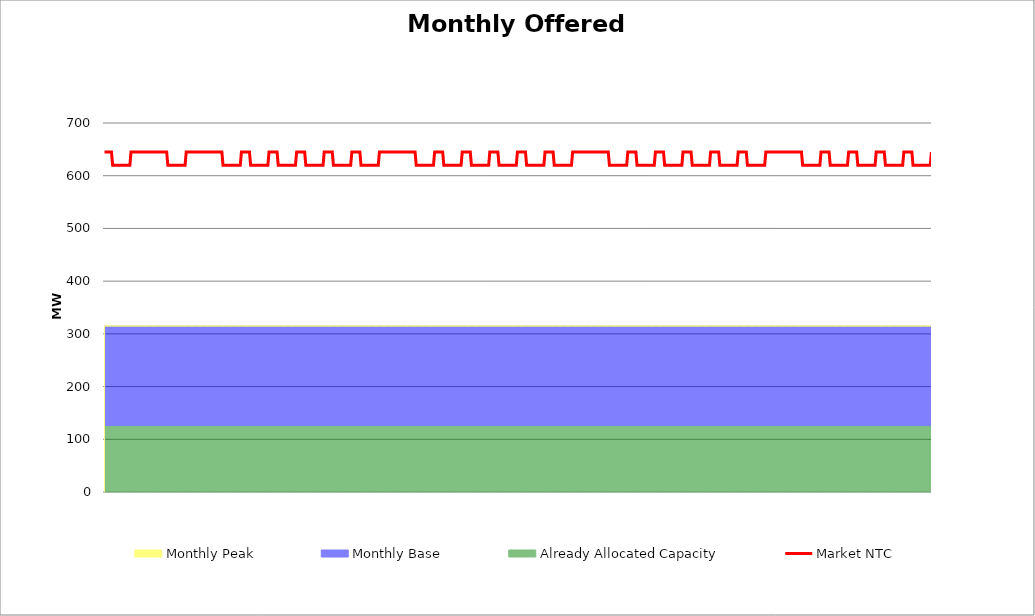
| Category | Market NTC |
|---|---|
| 0 | 645 |
| 1 | 645 |
| 2 | 645 |
| 3 | 645 |
| 4 | 645 |
| 5 | 645 |
| 6 | 645 |
| 7 | 620 |
| 8 | 620 |
| 9 | 620 |
| 10 | 620 |
| 11 | 620 |
| 12 | 620 |
| 13 | 620 |
| 14 | 620 |
| 15 | 620 |
| 16 | 620 |
| 17 | 620 |
| 18 | 620 |
| 19 | 620 |
| 20 | 620 |
| 21 | 620 |
| 22 | 620 |
| 23 | 645 |
| 24 | 645 |
| 25 | 645 |
| 26 | 645 |
| 27 | 645 |
| 28 | 645 |
| 29 | 645 |
| 30 | 645 |
| 31 | 645 |
| 32 | 645 |
| 33 | 645 |
| 34 | 645 |
| 35 | 645 |
| 36 | 645 |
| 37 | 645 |
| 38 | 645 |
| 39 | 645 |
| 40 | 645 |
| 41 | 645 |
| 42 | 645 |
| 43 | 645 |
| 44 | 645 |
| 45 | 645 |
| 46 | 645 |
| 47 | 645 |
| 48 | 645 |
| 49 | 645 |
| 50 | 645 |
| 51 | 645 |
| 52 | 645 |
| 53 | 645 |
| 54 | 645 |
| 55 | 620 |
| 56 | 620 |
| 57 | 620 |
| 58 | 620 |
| 59 | 620 |
| 60 | 620 |
| 61 | 620 |
| 62 | 620 |
| 63 | 620 |
| 64 | 620 |
| 65 | 620 |
| 66 | 620 |
| 67 | 620 |
| 68 | 620 |
| 69 | 620 |
| 70 | 620 |
| 71 | 645 |
| 72 | 645 |
| 73 | 645 |
| 74 | 645 |
| 75 | 645 |
| 76 | 645 |
| 77 | 645 |
| 78 | 645 |
| 79 | 645 |
| 80 | 645 |
| 81 | 645 |
| 82 | 645 |
| 83 | 645 |
| 84 | 645 |
| 85 | 645 |
| 86 | 645 |
| 87 | 645 |
| 88 | 645 |
| 89 | 645 |
| 90 | 645 |
| 91 | 645 |
| 92 | 645 |
| 93 | 645 |
| 94 | 645 |
| 95 | 645 |
| 96 | 645 |
| 97 | 645 |
| 98 | 645 |
| 99 | 645 |
| 100 | 645 |
| 101 | 645 |
| 102 | 645 |
| 103 | 620 |
| 104 | 620 |
| 105 | 620 |
| 106 | 620 |
| 107 | 620 |
| 108 | 620 |
| 109 | 620 |
| 110 | 620 |
| 111 | 620 |
| 112 | 620 |
| 113 | 620 |
| 114 | 620 |
| 115 | 620 |
| 116 | 620 |
| 117 | 620 |
| 118 | 620 |
| 119 | 645 |
| 120 | 645 |
| 121 | 645 |
| 122 | 645 |
| 123 | 645 |
| 124 | 645 |
| 125 | 645 |
| 126 | 645 |
| 127 | 620 |
| 128 | 620 |
| 129 | 620 |
| 130 | 620 |
| 131 | 620 |
| 132 | 620 |
| 133 | 620 |
| 134 | 620 |
| 135 | 620 |
| 136 | 620 |
| 137 | 620 |
| 138 | 620 |
| 139 | 620 |
| 140 | 620 |
| 141 | 620 |
| 142 | 620 |
| 143 | 645 |
| 144 | 645 |
| 145 | 645 |
| 146 | 645 |
| 147 | 645 |
| 148 | 645 |
| 149 | 645 |
| 150 | 645 |
| 151 | 620 |
| 152 | 620 |
| 153 | 620 |
| 154 | 620 |
| 155 | 620 |
| 156 | 620 |
| 157 | 620 |
| 158 | 620 |
| 159 | 620 |
| 160 | 620 |
| 161 | 620 |
| 162 | 620 |
| 163 | 620 |
| 164 | 620 |
| 165 | 620 |
| 166 | 620 |
| 167 | 645 |
| 168 | 645 |
| 169 | 645 |
| 170 | 645 |
| 171 | 645 |
| 172 | 645 |
| 173 | 645 |
| 174 | 645 |
| 175 | 620 |
| 176 | 620 |
| 177 | 620 |
| 178 | 620 |
| 179 | 620 |
| 180 | 620 |
| 181 | 620 |
| 182 | 620 |
| 183 | 620 |
| 184 | 620 |
| 185 | 620 |
| 186 | 620 |
| 187 | 620 |
| 188 | 620 |
| 189 | 620 |
| 190 | 620 |
| 191 | 645 |
| 192 | 645 |
| 193 | 645 |
| 194 | 645 |
| 195 | 645 |
| 196 | 645 |
| 197 | 645 |
| 198 | 645 |
| 199 | 620 |
| 200 | 620 |
| 201 | 620 |
| 202 | 620 |
| 203 | 620 |
| 204 | 620 |
| 205 | 620 |
| 206 | 620 |
| 207 | 620 |
| 208 | 620 |
| 209 | 620 |
| 210 | 620 |
| 211 | 620 |
| 212 | 620 |
| 213 | 620 |
| 214 | 620 |
| 215 | 645 |
| 216 | 645 |
| 217 | 645 |
| 218 | 645 |
| 219 | 645 |
| 220 | 645 |
| 221 | 645 |
| 222 | 645 |
| 223 | 620 |
| 224 | 620 |
| 225 | 620 |
| 226 | 620 |
| 227 | 620 |
| 228 | 620 |
| 229 | 620 |
| 230 | 620 |
| 231 | 620 |
| 232 | 620 |
| 233 | 620 |
| 234 | 620 |
| 235 | 620 |
| 236 | 620 |
| 237 | 620 |
| 238 | 620 |
| 239 | 645 |
| 240 | 645 |
| 241 | 645 |
| 242 | 645 |
| 243 | 645 |
| 244 | 645 |
| 245 | 645 |
| 246 | 645 |
| 247 | 645 |
| 248 | 645 |
| 249 | 645 |
| 250 | 645 |
| 251 | 645 |
| 252 | 645 |
| 253 | 645 |
| 254 | 645 |
| 255 | 645 |
| 256 | 645 |
| 257 | 645 |
| 258 | 645 |
| 259 | 645 |
| 260 | 645 |
| 261 | 645 |
| 262 | 645 |
| 263 | 645 |
| 264 | 645 |
| 265 | 645 |
| 266 | 645 |
| 267 | 645 |
| 268 | 645 |
| 269 | 645 |
| 270 | 645 |
| 271 | 620 |
| 272 | 620 |
| 273 | 620 |
| 274 | 620 |
| 275 | 620 |
| 276 | 620 |
| 277 | 620 |
| 278 | 620 |
| 279 | 620 |
| 280 | 620 |
| 281 | 620 |
| 282 | 620 |
| 283 | 620 |
| 284 | 620 |
| 285 | 620 |
| 286 | 620 |
| 287 | 645 |
| 288 | 645 |
| 289 | 645 |
| 290 | 645 |
| 291 | 645 |
| 292 | 645 |
| 293 | 645 |
| 294 | 645 |
| 295 | 620 |
| 296 | 620 |
| 297 | 620 |
| 298 | 620 |
| 299 | 620 |
| 300 | 620 |
| 301 | 620 |
| 302 | 620 |
| 303 | 620 |
| 304 | 620 |
| 305 | 620 |
| 306 | 620 |
| 307 | 620 |
| 308 | 620 |
| 309 | 620 |
| 310 | 620 |
| 311 | 645 |
| 312 | 645 |
| 313 | 645 |
| 314 | 645 |
| 315 | 645 |
| 316 | 645 |
| 317 | 645 |
| 318 | 645 |
| 319 | 620 |
| 320 | 620 |
| 321 | 620 |
| 322 | 620 |
| 323 | 620 |
| 324 | 620 |
| 325 | 620 |
| 326 | 620 |
| 327 | 620 |
| 328 | 620 |
| 329 | 620 |
| 330 | 620 |
| 331 | 620 |
| 332 | 620 |
| 333 | 620 |
| 334 | 620 |
| 335 | 645 |
| 336 | 645 |
| 337 | 645 |
| 338 | 645 |
| 339 | 645 |
| 340 | 645 |
| 341 | 645 |
| 342 | 645 |
| 343 | 620 |
| 344 | 620 |
| 345 | 620 |
| 346 | 620 |
| 347 | 620 |
| 348 | 620 |
| 349 | 620 |
| 350 | 620 |
| 351 | 620 |
| 352 | 620 |
| 353 | 620 |
| 354 | 620 |
| 355 | 620 |
| 356 | 620 |
| 357 | 620 |
| 358 | 620 |
| 359 | 645 |
| 360 | 645 |
| 361 | 645 |
| 362 | 645 |
| 363 | 645 |
| 364 | 645 |
| 365 | 645 |
| 366 | 645 |
| 367 | 620 |
| 368 | 620 |
| 369 | 620 |
| 370 | 620 |
| 371 | 620 |
| 372 | 620 |
| 373 | 620 |
| 374 | 620 |
| 375 | 620 |
| 376 | 620 |
| 377 | 620 |
| 378 | 620 |
| 379 | 620 |
| 380 | 620 |
| 381 | 620 |
| 382 | 620 |
| 383 | 645 |
| 384 | 645 |
| 385 | 645 |
| 386 | 645 |
| 387 | 645 |
| 388 | 645 |
| 389 | 645 |
| 390 | 645 |
| 391 | 620 |
| 392 | 620 |
| 393 | 620 |
| 394 | 620 |
| 395 | 620 |
| 396 | 620 |
| 397 | 620 |
| 398 | 620 |
| 399 | 620 |
| 400 | 620 |
| 401 | 620 |
| 402 | 620 |
| 403 | 620 |
| 404 | 620 |
| 405 | 620 |
| 406 | 620 |
| 407 | 645 |
| 408 | 645 |
| 409 | 645 |
| 410 | 645 |
| 411 | 645 |
| 412 | 645 |
| 413 | 645 |
| 414 | 645 |
| 415 | 645 |
| 416 | 645 |
| 417 | 645 |
| 418 | 645 |
| 419 | 645 |
| 420 | 645 |
| 421 | 645 |
| 422 | 645 |
| 423 | 645 |
| 424 | 645 |
| 425 | 645 |
| 426 | 645 |
| 427 | 645 |
| 428 | 645 |
| 429 | 645 |
| 430 | 645 |
| 431 | 645 |
| 432 | 645 |
| 433 | 645 |
| 434 | 645 |
| 435 | 645 |
| 436 | 645 |
| 437 | 645 |
| 438 | 645 |
| 439 | 620 |
| 440 | 620 |
| 441 | 620 |
| 442 | 620 |
| 443 | 620 |
| 444 | 620 |
| 445 | 620 |
| 446 | 620 |
| 447 | 620 |
| 448 | 620 |
| 449 | 620 |
| 450 | 620 |
| 451 | 620 |
| 452 | 620 |
| 453 | 620 |
| 454 | 620 |
| 455 | 645 |
| 456 | 645 |
| 457 | 645 |
| 458 | 645 |
| 459 | 645 |
| 460 | 645 |
| 461 | 645 |
| 462 | 645 |
| 463 | 620 |
| 464 | 620 |
| 465 | 620 |
| 466 | 620 |
| 467 | 620 |
| 468 | 620 |
| 469 | 620 |
| 470 | 620 |
| 471 | 620 |
| 472 | 620 |
| 473 | 620 |
| 474 | 620 |
| 475 | 620 |
| 476 | 620 |
| 477 | 620 |
| 478 | 620 |
| 479 | 645 |
| 480 | 645 |
| 481 | 645 |
| 482 | 645 |
| 483 | 645 |
| 484 | 645 |
| 485 | 645 |
| 486 | 645 |
| 487 | 620 |
| 488 | 620 |
| 489 | 620 |
| 490 | 620 |
| 491 | 620 |
| 492 | 620 |
| 493 | 620 |
| 494 | 620 |
| 495 | 620 |
| 496 | 620 |
| 497 | 620 |
| 498 | 620 |
| 499 | 620 |
| 500 | 620 |
| 501 | 620 |
| 502 | 620 |
| 503 | 645 |
| 504 | 645 |
| 505 | 645 |
| 506 | 645 |
| 507 | 645 |
| 508 | 645 |
| 509 | 645 |
| 510 | 645 |
| 511 | 620 |
| 512 | 620 |
| 513 | 620 |
| 514 | 620 |
| 515 | 620 |
| 516 | 620 |
| 517 | 620 |
| 518 | 620 |
| 519 | 620 |
| 520 | 620 |
| 521 | 620 |
| 522 | 620 |
| 523 | 620 |
| 524 | 620 |
| 525 | 620 |
| 526 | 620 |
| 527 | 645 |
| 528 | 645 |
| 529 | 645 |
| 530 | 645 |
| 531 | 645 |
| 532 | 645 |
| 533 | 645 |
| 534 | 645 |
| 535 | 620 |
| 536 | 620 |
| 537 | 620 |
| 538 | 620 |
| 539 | 620 |
| 540 | 620 |
| 541 | 620 |
| 542 | 620 |
| 543 | 620 |
| 544 | 620 |
| 545 | 620 |
| 546 | 620 |
| 547 | 620 |
| 548 | 620 |
| 549 | 620 |
| 550 | 620 |
| 551 | 645 |
| 552 | 645 |
| 553 | 645 |
| 554 | 645 |
| 555 | 645 |
| 556 | 645 |
| 557 | 645 |
| 558 | 645 |
| 559 | 620 |
| 560 | 620 |
| 561 | 620 |
| 562 | 620 |
| 563 | 620 |
| 564 | 620 |
| 565 | 620 |
| 566 | 620 |
| 567 | 620 |
| 568 | 620 |
| 569 | 620 |
| 570 | 620 |
| 571 | 620 |
| 572 | 620 |
| 573 | 620 |
| 574 | 620 |
| 575 | 645 |
| 576 | 645 |
| 577 | 645 |
| 578 | 645 |
| 579 | 645 |
| 580 | 645 |
| 581 | 645 |
| 582 | 645 |
| 583 | 645 |
| 584 | 645 |
| 585 | 645 |
| 586 | 645 |
| 587 | 645 |
| 588 | 645 |
| 589 | 645 |
| 590 | 645 |
| 591 | 645 |
| 592 | 645 |
| 593 | 645 |
| 594 | 645 |
| 595 | 645 |
| 596 | 645 |
| 597 | 645 |
| 598 | 645 |
| 599 | 645 |
| 600 | 645 |
| 601 | 645 |
| 602 | 645 |
| 603 | 645 |
| 604 | 645 |
| 605 | 645 |
| 606 | 645 |
| 607 | 620 |
| 608 | 620 |
| 609 | 620 |
| 610 | 620 |
| 611 | 620 |
| 612 | 620 |
| 613 | 620 |
| 614 | 620 |
| 615 | 620 |
| 616 | 620 |
| 617 | 620 |
| 618 | 620 |
| 619 | 620 |
| 620 | 620 |
| 621 | 620 |
| 622 | 620 |
| 623 | 645 |
| 624 | 645 |
| 625 | 645 |
| 626 | 645 |
| 627 | 645 |
| 628 | 645 |
| 629 | 645 |
| 630 | 645 |
| 631 | 620 |
| 632 | 620 |
| 633 | 620 |
| 634 | 620 |
| 635 | 620 |
| 636 | 620 |
| 637 | 620 |
| 638 | 620 |
| 639 | 620 |
| 640 | 620 |
| 641 | 620 |
| 642 | 620 |
| 643 | 620 |
| 644 | 620 |
| 645 | 620 |
| 646 | 620 |
| 647 | 645 |
| 648 | 645 |
| 649 | 645 |
| 650 | 645 |
| 651 | 645 |
| 652 | 645 |
| 653 | 645 |
| 654 | 645 |
| 655 | 620 |
| 656 | 620 |
| 657 | 620 |
| 658 | 620 |
| 659 | 620 |
| 660 | 620 |
| 661 | 620 |
| 662 | 620 |
| 663 | 620 |
| 664 | 620 |
| 665 | 620 |
| 666 | 620 |
| 667 | 620 |
| 668 | 620 |
| 669 | 620 |
| 670 | 620 |
| 671 | 645 |
| 672 | 645 |
| 673 | 645 |
| 674 | 645 |
| 675 | 645 |
| 676 | 645 |
| 677 | 645 |
| 678 | 645 |
| 679 | 620 |
| 680 | 620 |
| 681 | 620 |
| 682 | 620 |
| 683 | 620 |
| 684 | 620 |
| 685 | 620 |
| 686 | 620 |
| 687 | 620 |
| 688 | 620 |
| 689 | 620 |
| 690 | 620 |
| 691 | 620 |
| 692 | 620 |
| 693 | 620 |
| 694 | 620 |
| 695 | 645 |
| 696 | 645 |
| 697 | 645 |
| 698 | 645 |
| 699 | 645 |
| 700 | 645 |
| 701 | 645 |
| 702 | 645 |
| 703 | 620 |
| 704 | 620 |
| 705 | 620 |
| 706 | 620 |
| 707 | 620 |
| 708 | 620 |
| 709 | 620 |
| 710 | 620 |
| 711 | 620 |
| 712 | 620 |
| 713 | 620 |
| 714 | 620 |
| 715 | 620 |
| 716 | 620 |
| 717 | 620 |
| 718 | 620 |
| 719 | 645 |